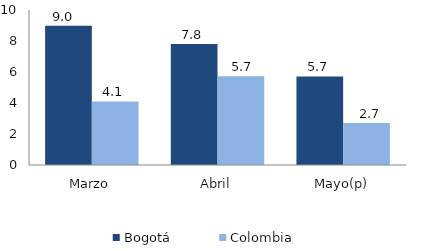
| Category | Bogotá | Colombia |
|---|---|---|
| Marzo | 8.986 | 4.101 |
| Abril | 7.8 | 5.725 |
| Mayo(p) | 5.712 | 2.706 |